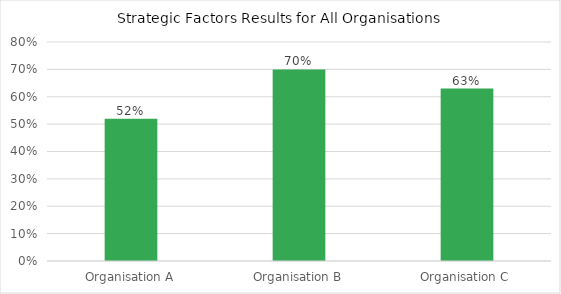
| Category | Strategic Factors |
|---|---|
| Organisation A | 0.52 |
| Organisation B | 0.7 |
| Organisation C | 0.63 |